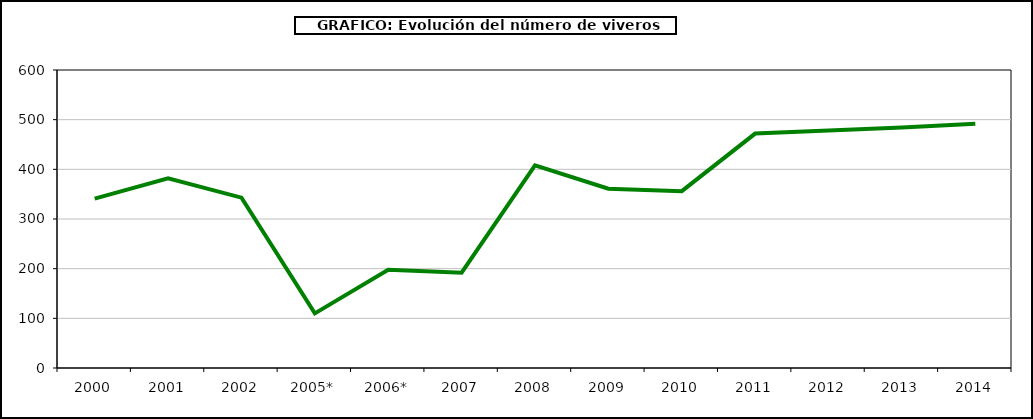
| Category | Series 0 |
|---|---|
| 2000 | 341 |
| 2001 | 382 |
| 2002 | 343 |
| 2005* | 110 |
| 2006* | 198 |
| 2007 | 192 |
| 2008 | 408 |
| 2009 | 361 |
| 2010 | 356 |
| 2011 | 472 |
| 2012 | 478 |
| 2013 | 484 |
| 2014 | 492 |